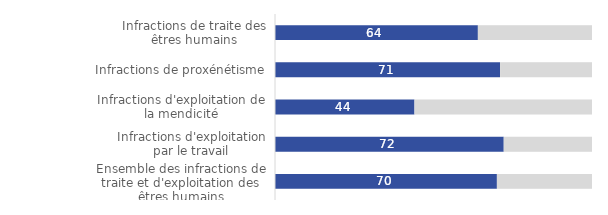
| Category | Series 1 | Series 0 |
|---|---|---|
| Infractions de traite des êtres humains | 64 | 36 |
| Infractions de proxénétisme | 71 | 29 |
| Infractions d'exploitation de la mendicité | 44 | 56 |
| Infractions d'exploitation par le travail | 72.158 | 27.842 |
| Ensemble des infractions de traite et d'exploitation des êtres humains | 70 | 30 |